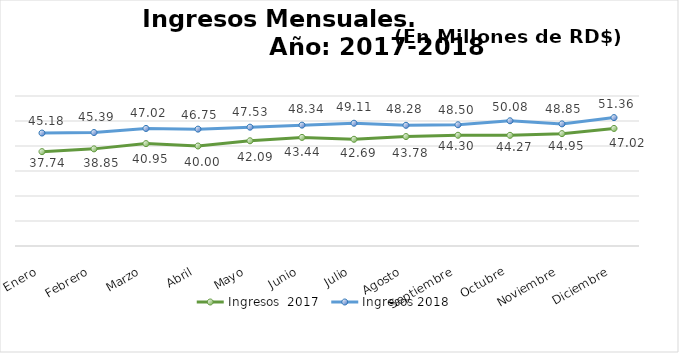
| Category | Ingresos  2017 | Ingresos 2018 |
|---|---|---|
| Enero | 37.743 | 45.176 |
| Febrero | 38.852 | 45.387 |
| Marzo | 40.952 | 47.019 |
| Abril | 39.999 | 46.746 |
| Mayo | 42.088 | 47.526 |
| Junio | 43.442 | 48.343 |
| Julio | 42.689 | 49.111 |
| Agosto | 43.776 | 48.276 |
| Septiembre | 44.299 | 48.498 |
| Octubre | 44.272 | 50.082 |
| Noviembre | 44.948 | 48.85 |
| Diciembre | 47.024 | 51.357 |